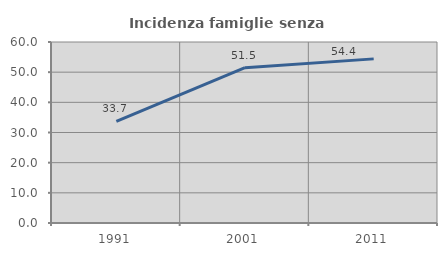
| Category | Incidenza famiglie senza nuclei |
|---|---|
| 1991.0 | 33.679 |
| 2001.0 | 51.477 |
| 2011.0 | 54.406 |